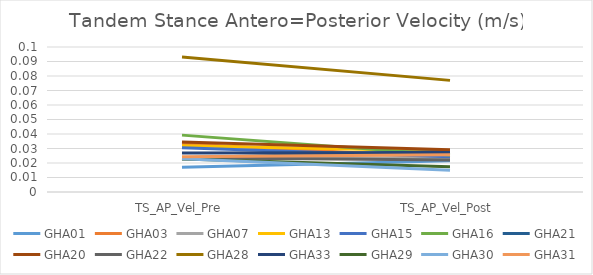
| Category | GHA01 | GHA03 | GHA07 | GHA13 | GHA15 | GHA16 | GHA21 | GHA20 | GHA22 | GHA28 | GHA33 | GHA29 | GHA30 | GHA31 |
|---|---|---|---|---|---|---|---|---|---|---|---|---|---|---|
| TS_AP_Vel_Pre | 0.017 | 0.033 | 0.023 | 0.032 | 0.031 | 0.039 | 0.024 | 0.034 | 0.024 | 0.093 | 0.027 | 0.023 | 0.023 | 0.024 |
| TS_AP_Vel_Post | 0.022 | 0.024 | 0.024 | 0.028 | 0.024 | 0.026 | 0.028 | 0.029 | 0.022 | 0.077 | 0.027 | 0.017 | 0.015 | 0.026 |